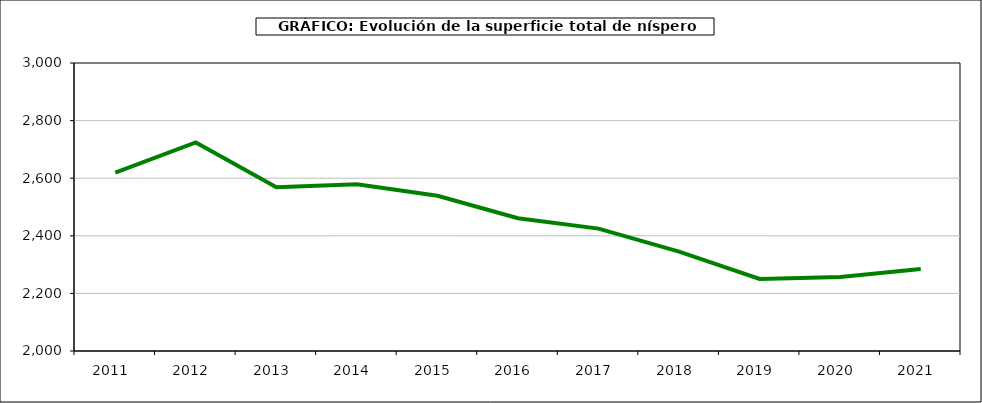
| Category | superficie níspero |
|---|---|
| 2011.0 | 2619 |
| 2012.0 | 2724 |
| 2013.0 | 2569 |
| 2014.0 | 2579 |
| 2015.0 | 2539 |
| 2016.0 | 2461 |
| 2017.0 | 2425 |
| 2018.0 | 2345 |
| 2019.0 | 2250 |
| 2020.0 | 2257 |
| 2021.0 | 2285 |